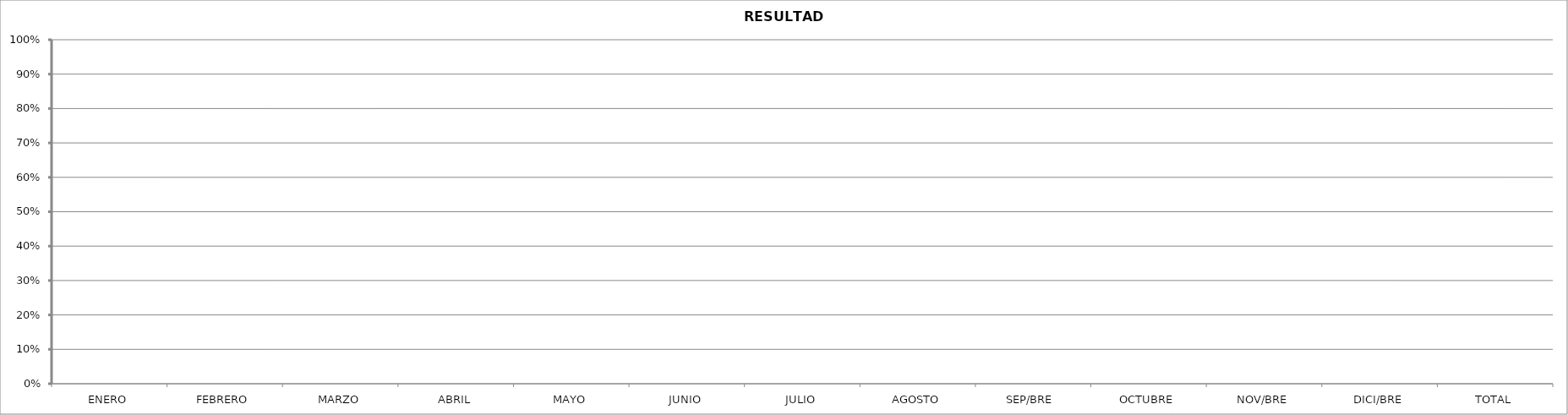
| Category | RESULTADO |
|---|---|
| ENERO | 0 |
| FEBRERO | 0 |
| MARZO | 0 |
| ABRIL | 0 |
| MAYO | 0 |
| JUNIO | 0 |
| JULIO | 0 |
| AGOSTO | 0 |
| SEP/BRE  | 0 |
| OCTUBRE | 0 |
| NOV/BRE | 0 |
| DICI/BRE | 0 |
| TOTAL | 0 |